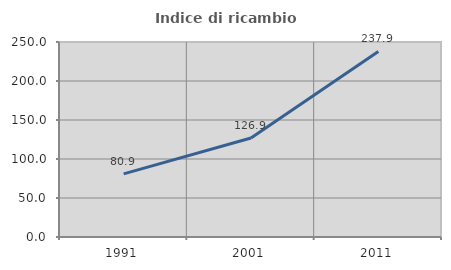
| Category | Indice di ricambio occupazionale  |
|---|---|
| 1991.0 | 80.879 |
| 2001.0 | 126.914 |
| 2011.0 | 237.868 |